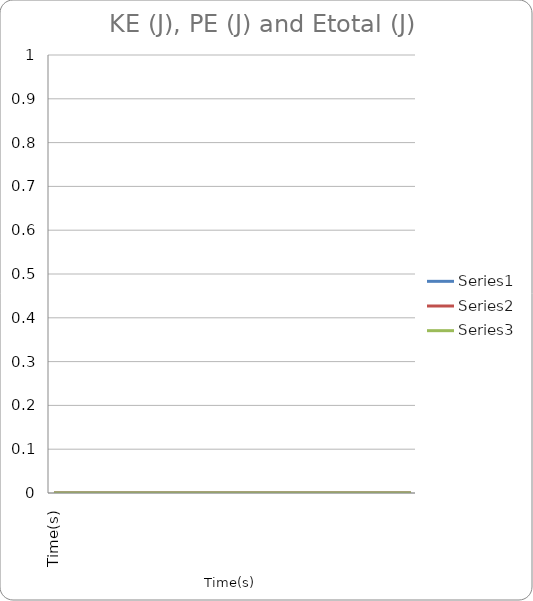
| Category | Series 0 | Series 1 | Series 2 |
|---|---|---|---|
| Time(s) | 0 | 0 | 0 |